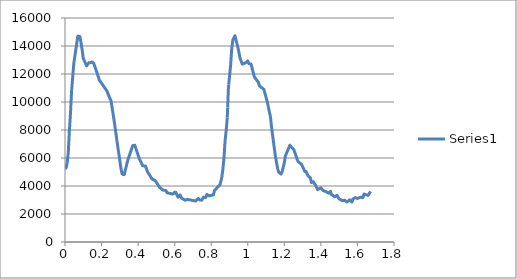
| Category | Series 0 |
|---|---|
| 0.0 | 5230.77 |
| 0.002 | 5251.89 |
| 0.004 | 5273.01 |
| 0.006 | 5294.12 |
| 0.008 | 5420.82 |
| 0.01 | 5547.52 |
| 0.012 | 5674.21 |
| 0.014 | 5917.04 |
| 0.016 | 6159.87 |
| 0.018 | 6402.71 |
| 0.02 | 6920.06 |
| 0.022 | 7437.41 |
| 0.024 | 7954.75 |
| 0.026 | 8366.52 |
| 0.028 | 8778.29 |
| 0.03 | 9190.05 |
| 0.032 | 9717.97 |
| 0.034 | 10245.89 |
| 0.036 | 10773.8 |
| 0.038 | 11101.1 |
| 0.04 | 11428.4 |
| 0.042 | 11755.7 |
| 0.044 | 12083 |
| 0.046 | 12410.3 |
| 0.048 | 12737.6 |
| 0.05 | 12916.13 |
| 0.052 | 13094.66 |
| 0.054 | 13273.19 |
| 0.056 | 13451.72 |
| 0.058 | 13630.25 |
| 0.06 | 13808.78 |
| 0.062 | 13987.31 |
| 0.064 | 14165.84 |
| 0.066 | 14344.37 |
| 0.068 | 14522.9 |
| 0.07 | 14701.4 |
| 0.072 | 14694.62 |
| 0.074 | 14687.84 |
| 0.076 | 14681.06 |
| 0.078 | 14674.28 |
| 0.08 | 14667.5 |
| 0.082 | 14660.7 |
| 0.084 | 14503.83 |
| 0.086 | 14346.96 |
| 0.088 | 14190.09 |
| 0.09 | 14033.22 |
| 0.092 | 13876.35 |
| 0.094 | 13719.5 |
| 0.096 | 13518.87 |
| 0.098 | 13318.24 |
| 0.1 | 13117.6 |
| 0.102 | 13057.78 |
| 0.104 | 12997.96 |
| 0.106 | 12938.14 |
| 0.108 | 12878.32 |
| 0.11 | 12818.5 |
| 0.112 | 12758.68 |
| 0.114 | 12698.86 |
| 0.116 | 12639.04 |
| 0.118 | 12579.2 |
| 0.12 | 12616.15 |
| 0.122 | 12653.1 |
| 0.124 | 12690.05 |
| 0.126 | 12727 |
| 0.128 | 12763.95 |
| 0.13 | 12800.9 |
| 0.132 | 12800.9 |
| 0.134 | 12800.9 |
| 0.136 | 12800.9 |
| 0.138 | 12811.47 |
| 0.14 | 12822.04 |
| 0.142 | 12832.61 |
| 0.144 | 12843.18 |
| 0.146 | 12853.75 |
| 0.148 | 12864.3 |
| 0.15 | 12838.96 |
| 0.152 | 12813.62 |
| 0.154 | 12788.28 |
| 0.156 | 12762.94 |
| 0.158 | 12737.6 |
| 0.16 | 12660.17 |
| 0.162 | 12582.74 |
| 0.164 | 12505.31 |
| 0.166 | 12427.88 |
| 0.168 | 12350.45 |
| 0.17 | 12273.02 |
| 0.172 | 12195.59 |
| 0.174 | 12118.16 |
| 0.176 | 12040.7 |
| 0.178 | 11961.68 |
| 0.18 | 11882.66 |
| 0.182 | 11803.64 |
| 0.184 | 11724.62 |
| 0.186 | 11645.6 |
| 0.188 | 11565.6 |
| 0.19 | 11527.9 |
| 0.192 | 11490.2 |
| 0.194 | 11452.5 |
| 0.196 | 11414.8 |
| 0.198 | 11377.1 |
| 0.2 | 11339.4 |
| 0.202 | 11301.7 |
| 0.204 | 11264 |
| 0.206 | 11226.3 |
| 0.208 | 11188.6 |
| 0.21 | 11150.9 |
| 0.212 | 11113.2 |
| 0.214 | 11075.5 |
| 0.216 | 11037.8 |
| 0.218 | 11000.1 |
| 0.22 | 10962.4 |
| 0.222 | 10924.7 |
| 0.224 | 10887 |
| 0.226 | 10849.3 |
| 0.228 | 10811.6 |
| 0.23 | 10773.8 |
| 0.232 | 10705.17 |
| 0.234 | 10636.54 |
| 0.236 | 10567.91 |
| 0.238 | 10499.28 |
| 0.24 | 10430.65 |
| 0.242 | 10362 |
| 0.244 | 10304.98 |
| 0.246 | 10247.96 |
| 0.248 | 10190.94 |
| 0.25 | 10133.92 |
| 0.252 | 10076.9 |
| 0.254 | 9907.97 |
| 0.256 | 9739.04 |
| 0.258 | 9570.11 |
| 0.26 | 9401.18 |
| 0.262 | 9232.25 |
| 0.264 | 9063.32 |
| 0.266 | 8894.39 |
| 0.268 | 8725.46 |
| 0.27 | 8556.56 |
| 0.272 | 8370.03 |
| 0.274 | 8183.5 |
| 0.276 | 7996.97 |
| 0.278 | 7810.44 |
| 0.28 | 7623.91 |
| 0.282 | 7437.38 |
| 0.284 | 7250.85 |
| 0.286 | 7064.32 |
| 0.288 | 6877.83 |
| 0.29 | 6698.34 |
| 0.292 | 6518.85 |
| 0.294 | 6339.36 |
| 0.296 | 6159.87 |
| 0.298 | 5980.38 |
| 0.3 | 5800.89 |
| 0.302 | 5621.4 |
| 0.304 | 5441.91 |
| 0.306 | 5262.44 |
| 0.308 | 5135.74 |
| 0.31 | 5009.04 |
| 0.312 | 4882.35 |
| 0.314 | 4861.23 |
| 0.316 | 4840.11 |
| 0.318 | 4819 |
| 0.32 | 4819 |
| 0.322 | 4819 |
| 0.324 | 4819 |
| 0.326 | 4924.58 |
| 0.328 | 5030.16 |
| 0.33 | 5135.74 |
| 0.332 | 5241.32 |
| 0.334 | 5346.9 |
| 0.336 | 5452.48 |
| 0.338 | 5558.06 |
| 0.34 | 5663.64 |
| 0.342 | 5769.23 |
| 0.344 | 5848.42 |
| 0.346 | 5927.61 |
| 0.348 | 6006.8 |
| 0.35 | 6085.99 |
| 0.352 | 6165.18 |
| 0.354 | 6244.37 |
| 0.356 | 6323.56 |
| 0.358 | 6402.75 |
| 0.36 | 6481.94 |
| 0.362 | 6561.13 |
| 0.364 | 6640.32 |
| 0.366 | 6719.51 |
| 0.368 | 6798.7 |
| 0.37 | 6877.83 |
| 0.372 | 6884.16 |
| 0.374 | 6890.49 |
| 0.376 | 6896.82 |
| 0.378 | 6903.15 |
| 0.38 | 6909.48 |
| 0.382 | 6909.5 |
| 0.384 | 6830.31 |
| 0.386 | 6751.12 |
| 0.388 | 6671.93 |
| 0.39 | 6592.74 |
| 0.392 | 6513.55 |
| 0.394 | 6434.36 |
| 0.396 | 6355.17 |
| 0.398 | 6275.98 |
| 0.4 | 6196.79 |
| 0.402 | 6117.6 |
| 0.404 | 6038.41 |
| 0.406 | 5959.28 |
| 0.408 | 5906.49 |
| 0.41 | 5853.7 |
| 0.412 | 5800.91 |
| 0.414 | 5748.12 |
| 0.416 | 5695.33 |
| 0.418 | 5642.53 |
| 0.42 | 5579.18 |
| 0.422 | 5515.83 |
| 0.424 | 5452.49 |
| 0.426 | 5448.53 |
| 0.428 | 5444.57 |
| 0.43 | 5440.61 |
| 0.432 | 5436.65 |
| 0.434 | 5432.69 |
| 0.436 | 5428.73 |
| 0.438 | 5424.77 |
| 0.44 | 5420.81 |
| 0.442 | 5352.18 |
| 0.444 | 5283.55 |
| 0.446 | 5214.92 |
| 0.448 | 5146.29 |
| 0.45 | 5077.66 |
| 0.452 | 5009.05 |
| 0.454 | 4966.82 |
| 0.456 | 4924.59 |
| 0.458 | 4882.36 |
| 0.46 | 4840.13 |
| 0.462 | 4797.9 |
| 0.464 | 4755.67 |
| 0.466 | 4713.44 |
| 0.468 | 4671.21 |
| 0.47 | 4628.98 |
| 0.472 | 4586.75 |
| 0.474 | 4544.52 |
| 0.476 | 4502.26 |
| 0.478 | 4488.18 |
| 0.48 | 4474.1 |
| 0.482 | 4460.02 |
| 0.484 | 4445.94 |
| 0.486 | 4431.86 |
| 0.488 | 4417.78 |
| 0.49 | 4403.7 |
| 0.492 | 4389.62 |
| 0.494 | 4375.57 |
| 0.496 | 4335.98 |
| 0.498 | 4296.39 |
| 0.5 | 4256.8 |
| 0.502 | 4217.21 |
| 0.504 | 4177.62 |
| 0.506 | 4138.03 |
| 0.508 | 4098.44 |
| 0.51 | 4058.85 |
| 0.512 | 4019.26 |
| 0.514 | 3979.67 |
| 0.516 | 3940.08 |
| 0.518 | 3900.45 |
| 0.52 | 3879.33 |
| 0.522 | 3858.21 |
| 0.524 | 3837.09 |
| 0.526 | 3815.97 |
| 0.528 | 3794.85 |
| 0.53 | 3773.73 |
| 0.532 | 3752.61 |
| 0.534 | 3731.49 |
| 0.536 | 3710.41 |
| 0.538 | 3706.45 |
| 0.54 | 3702.49 |
| 0.542 | 3698.53 |
| 0.544 | 3694.57 |
| 0.546 | 3690.61 |
| 0.548 | 3686.65 |
| 0.55 | 3682.69 |
| 0.552 | 3678.73 |
| 0.554 | 3625.94 |
| 0.556 | 3573.15 |
| 0.558 | 3520.36 |
| 0.56 | 3514.03 |
| 0.562 | 3507.7 |
| 0.564 | 3501.37 |
| 0.566 | 3495.04 |
| 0.568 | 3488.71 |
| 0.57 | 3482.38 |
| 0.572 | 3476.05 |
| 0.574 | 3469.72 |
| 0.576 | 3463.39 |
| 0.578 | 3457.06 |
| 0.58 | 3450.73 |
| 0.582 | 3444.4 |
| 0.584 | 3438.07 |
| 0.586 | 3431.74 |
| 0.588 | 3425.34 |
| 0.59 | 3435.9 |
| 0.592 | 3446.46 |
| 0.594 | 3457.01 |
| 0.596 | 3488.69 |
| 0.598 | 3520.37 |
| 0.6 | 3552.04 |
| 0.602 | 3552.04 |
| 0.604 | 3552.04 |
| 0.606 | 3552.04 |
| 0.608 | 3493.97 |
| 0.61 | 3435.9 |
| 0.612 | 3377.83 |
| 0.614 | 3319.76 |
| 0.616 | 3261.69 |
| 0.618 | 3203.62 |
| 0.62 | 3230.02 |
| 0.622 | 3256.42 |
| 0.624 | 3282.82 |
| 0.626 | 3309.22 |
| 0.628 | 3335.62 |
| 0.63 | 3361.99 |
| 0.632 | 3288.08 |
| 0.634 | 3214.17 |
| 0.636 | 3140.27 |
| 0.638 | 3125.87 |
| 0.64 | 3111.47 |
| 0.642 | 3097.07 |
| 0.644 | 3082.67 |
| 0.646 | 3068.27 |
| 0.648 | 3053.87 |
| 0.65 | 3039.47 |
| 0.652 | 3025.07 |
| 0.654 | 3010.67 |
| 0.656 | 2996.27 |
| 0.658 | 2981.9 |
| 0.66 | 2992.46 |
| 0.662 | 3003.02 |
| 0.664 | 3013.58 |
| 0.666 | 3024.14 |
| 0.668 | 3034.7 |
| 0.67 | 3045.25 |
| 0.672 | 3039.97 |
| 0.674 | 3034.69 |
| 0.676 | 3029.41 |
| 0.678 | 3024.13 |
| 0.68 | 3018.85 |
| 0.682 | 3013.57 |
| 0.684 | 3008.29 |
| 0.686 | 3003.01 |
| 0.688 | 2997.73 |
| 0.69 | 2992.45 |
| 0.692 | 2987.17 |
| 0.694 | 2981.89 |
| 0.696 | 2976.61 |
| 0.698 | 2971.33 |
| 0.7 | 2966.05 |
| 0.702 | 2960.77 |
| 0.704 | 2955.49 |
| 0.706 | 2950.23 |
| 0.708 | 2944.95 |
| 0.71 | 2939.67 |
| 0.712 | 2934.39 |
| 0.714 | 2929.11 |
| 0.716 | 2923.83 |
| 0.718 | 2981.9 |
| 0.72 | 3003.02 |
| 0.722 | 3024.14 |
| 0.724 | 3045.26 |
| 0.726 | 3066.38 |
| 0.728 | 3087.5 |
| 0.73 | 3108.6 |
| 0.732 | 3076.92 |
| 0.734 | 3045.24 |
| 0.736 | 3013.57 |
| 0.738 | 3008.29 |
| 0.74 | 3003.01 |
| 0.742 | 2997.73 |
| 0.744 | 2992.45 |
| 0.746 | 2987.17 |
| 0.748 | 2981.89 |
| 0.75 | 3026.04 |
| 0.752 | 3070.19 |
| 0.754 | 3114.34 |
| 0.756 | 3158.49 |
| 0.758 | 3202.62 |
| 0.76 | 3197.51 |
| 0.762 | 3192.4 |
| 0.764 | 3187.29 |
| 0.766 | 3182.18 |
| 0.768 | 3177.07 |
| 0.77 | 3171.95 |
| 0.772 | 3245.86 |
| 0.774 | 3319.77 |
| 0.776 | 3393.67 |
| 0.778 | 3377.83 |
| 0.78 | 3361.99 |
| 0.782 | 3346.15 |
| 0.784 | 3330.31 |
| 0.786 | 3314.47 |
| 0.788 | 3298.64 |
| 0.79 | 3303.92 |
| 0.792 | 3309.2 |
| 0.794 | 3314.48 |
| 0.796 | 3319.76 |
| 0.798 | 3325.04 |
| 0.8 | 3330.32 |
| 0.802 | 3335.6 |
| 0.804 | 3340.88 |
| 0.806 | 3346.16 |
| 0.808 | 3351.44 |
| 0.81 | 3356.72 |
| 0.812 | 3361.99 |
| 0.814 | 3467.57 |
| 0.816 | 3573.15 |
| 0.818 | 3678.73 |
| 0.82 | 3706.18 |
| 0.822 | 3733.63 |
| 0.824 | 3761.08 |
| 0.826 | 3788.53 |
| 0.828 | 3815.98 |
| 0.83 | 3843.43 |
| 0.832 | 3870.88 |
| 0.834 | 3898.33 |
| 0.836 | 3925.78 |
| 0.838 | 3953.23 |
| 0.84 | 3980.68 |
| 0.842 | 4008.13 |
| 0.844 | 4035.58 |
| 0.846 | 4063.03 |
| 0.848 | 4090.5 |
| 0.85 | 4198.19 |
| 0.852 | 4305.88 |
| 0.854 | 4413.57 |
| 0.856 | 4521.26 |
| 0.858 | 4628.96 |
| 0.86 | 4829.56 |
| 0.862 | 5030.16 |
| 0.864 | 5230.77 |
| 0.866 | 5505.28 |
| 0.868 | 5779.79 |
| 0.87 | 6054.3 |
| 0.872 | 6455.51 |
| 0.874 | 6856.72 |
| 0.876 | 7257.92 |
| 0.878 | 7500.76 |
| 0.88 | 7743.6 |
| 0.882 | 7986.43 |
| 0.884 | 8292.61 |
| 0.886 | 8598.79 |
| 0.888 | 8904.98 |
| 0.89 | 9601.82 |
| 0.892 | 10298.66 |
| 0.894 | 10995.5 |
| 0.896 | 11264.73 |
| 0.898 | 11533.96 |
| 0.9 | 11803.19 |
| 0.902 | 12072.42 |
| 0.904 | 12341.65 |
| 0.906 | 12610.9 |
| 0.908 | 13001.53 |
| 0.91 | 13392.16 |
| 0.912 | 13782.8 |
| 0.914 | 13993.97 |
| 0.916 | 14205.14 |
| 0.918 | 14416.3 |
| 0.92 | 14469.08 |
| 0.922 | 14521.86 |
| 0.924 | 14574.64 |
| 0.926 | 14627.42 |
| 0.928 | 14680.2 |
| 0.93 | 14733 |
| 0.932 | 14627.42 |
| 0.934 | 14521.84 |
| 0.936 | 14416.26 |
| 0.938 | 14310.68 |
| 0.94 | 14205.1 |
| 0.942 | 14099.52 |
| 0.944 | 13993.94 |
| 0.946 | 13888.36 |
| 0.948 | 13782.8 |
| 0.95 | 13649.76 |
| 0.952 | 13516.72 |
| 0.954 | 13383.68 |
| 0.956 | 13250.64 |
| 0.958 | 13117.6 |
| 0.96 | 13048.98 |
| 0.962 | 12980.36 |
| 0.964 | 12911.74 |
| 0.966 | 12843.12 |
| 0.968 | 12774.5 |
| 0.97 | 12705.9 |
| 0.972 | 12716.46 |
| 0.974 | 12727.02 |
| 0.976 | 12737.58 |
| 0.978 | 12748.14 |
| 0.98 | 12758.7 |
| 0.982 | 12769.26 |
| 0.984 | 12779.82 |
| 0.986 | 12790.38 |
| 0.988 | 12800.9 |
| 0.99 | 12822.02 |
| 0.992 | 12843.14 |
| 0.994 | 12864.26 |
| 0.996 | 12885.38 |
| 0.998 | 12906.5 |
| 1.0 | 12927.6 |
| 1.002 | 12864.27 |
| 1.004 | 12800.94 |
| 1.006 | 12737.6 |
| 1.008 | 12732.32 |
| 1.01 | 12727.04 |
| 1.012 | 12721.76 |
| 1.014 | 12716.48 |
| 1.016 | 12711.2 |
| 1.018 | 12705.9 |
| 1.02 | 12603.83 |
| 1.022 | 12501.76 |
| 1.024 | 12399.69 |
| 1.026 | 12297.62 |
| 1.028 | 12195.55 |
| 1.03 | 12093.48 |
| 1.032 | 11991.41 |
| 1.034 | 11889.34 |
| 1.036 | 11787.3 |
| 1.038 | 11752.75 |
| 1.04 | 11718.2 |
| 1.042 | 11683.65 |
| 1.044 | 11649.1 |
| 1.046 | 11614.55 |
| 1.048 | 11580 |
| 1.05 | 11545.45 |
| 1.052 | 11510.9 |
| 1.054 | 11476.35 |
| 1.056 | 11441.8 |
| 1.058 | 11407.2 |
| 1.06 | 11322.73 |
| 1.062 | 11238.26 |
| 1.064 | 11153.8 |
| 1.066 | 11132.69 |
| 1.068 | 11111.58 |
| 1.07 | 11090.47 |
| 1.072 | 11069.36 |
| 1.074 | 11048.25 |
| 1.076 | 11027.14 |
| 1.078 | 11006.03 |
| 1.08 | 10984.92 |
| 1.082 | 10963.81 |
| 1.084 | 10942.7 |
| 1.086 | 10921.59 |
| 1.088 | 10900.5 |
| 1.09 | 10805.47 |
| 1.092 | 10710.44 |
| 1.094 | 10615.41 |
| 1.096 | 10520.38 |
| 1.098 | 10425.35 |
| 1.1 | 10330.32 |
| 1.102 | 10235.29 |
| 1.104 | 10140.26 |
| 1.106 | 10045.2 |
| 1.108 | 9922.03 |
| 1.11 | 9798.86 |
| 1.112 | 9675.69 |
| 1.114 | 9552.52 |
| 1.116 | 9429.35 |
| 1.118 | 9306.18 |
| 1.12 | 9183.01 |
| 1.122 | 9059.84 |
| 1.124 | 8936.65 |
| 1.126 | 8693.81 |
| 1.128 | 8450.97 |
| 1.13 | 8208.14 |
| 1.132 | 8007.54 |
| 1.134 | 7806.94 |
| 1.136 | 7606.34 |
| 1.138 | 7405.74 |
| 1.14 | 7205.14 |
| 1.142 | 7004.52 |
| 1.144 | 6814.48 |
| 1.146 | 6624.44 |
| 1.148 | 6434.4 |
| 1.15 | 6244.36 |
| 1.152 | 6054.3 |
| 1.154 | 5911.77 |
| 1.156 | 5769.24 |
| 1.158 | 5626.71 |
| 1.16 | 5484.18 |
| 1.162 | 5341.65 |
| 1.164 | 5199.1 |
| 1.166 | 5125.19 |
| 1.168 | 5051.28 |
| 1.17 | 4977.38 |
| 1.172 | 4956.26 |
| 1.174 | 4935.14 |
| 1.176 | 4914.02 |
| 1.178 | 4892.9 |
| 1.18 | 4871.78 |
| 1.182 | 4850.68 |
| 1.184 | 4903.47 |
| 1.186 | 4956.26 |
| 1.188 | 5009.05 |
| 1.19 | 5119.91 |
| 1.192 | 5230.77 |
| 1.194 | 5341.63 |
| 1.196 | 5452.49 |
| 1.198 | 5563.35 |
| 1.2 | 5674.21 |
| 1.202 | 5832.58 |
| 1.204 | 5990.95 |
| 1.206 | 6149.32 |
| 1.208 | 6212.67 |
| 1.21 | 6276.02 |
| 1.212 | 6339.37 |
| 1.214 | 6402.72 |
| 1.216 | 6466.07 |
| 1.218 | 6529.42 |
| 1.22 | 6592.77 |
| 1.222 | 6656.12 |
| 1.224 | 6719.47 |
| 1.226 | 6782.82 |
| 1.228 | 6846.17 |
| 1.23 | 6909.5 |
| 1.232 | 6880.71 |
| 1.234 | 6851.92 |
| 1.236 | 6823.13 |
| 1.238 | 6794.34 |
| 1.24 | 6765.55 |
| 1.242 | 6736.76 |
| 1.244 | 6707.97 |
| 1.246 | 6679.18 |
| 1.248 | 6650.39 |
| 1.25 | 6621.6 |
| 1.252 | 6592.76 |
| 1.254 | 6518.85 |
| 1.256 | 6444.94 |
| 1.258 | 6371.03 |
| 1.26 | 6297.12 |
| 1.262 | 6223.21 |
| 1.264 | 6149.32 |
| 1.266 | 6064.86 |
| 1.268 | 5980.4 |
| 1.27 | 5895.93 |
| 1.272 | 5843.14 |
| 1.274 | 5790.35 |
| 1.276 | 5737.56 |
| 1.278 | 5716.44 |
| 1.28 | 5695.32 |
| 1.282 | 5674.2 |
| 1.284 | 5653.08 |
| 1.286 | 5631.96 |
| 1.288 | 5610.84 |
| 1.29 | 5589.72 |
| 1.292 | 5568.6 |
| 1.294 | 5547.51 |
| 1.296 | 5491.2 |
| 1.298 | 5434.89 |
| 1.3 | 5378.58 |
| 1.302 | 5322.27 |
| 1.304 | 5265.96 |
| 1.306 | 5209.65 |
| 1.308 | 5153.34 |
| 1.31 | 5097.03 |
| 1.312 | 5040.72 |
| 1.314 | 5040.72 |
| 1.316 | 5040.72 |
| 1.318 | 5040.72 |
| 1.32 | 4987.93 |
| 1.322 | 4935.14 |
| 1.324 | 4882.35 |
| 1.326 | 4829.56 |
| 1.328 | 4776.77 |
| 1.33 | 4723.98 |
| 1.332 | 4702.86 |
| 1.334 | 4681.74 |
| 1.336 | 4660.62 |
| 1.338 | 4639.5 |
| 1.34 | 4618.38 |
| 1.342 | 4597.29 |
| 1.344 | 4481.15 |
| 1.346 | 4365.01 |
| 1.348 | 4248.87 |
| 1.35 | 4261.54 |
| 1.352 | 4274.21 |
| 1.354 | 4286.88 |
| 1.356 | 4299.55 |
| 1.358 | 4312.22 |
| 1.36 | 4275.27 |
| 1.362 | 4238.32 |
| 1.364 | 4193.98 |
| 1.366 | 4149.64 |
| 1.368 | 4105.3 |
| 1.37 | 4090.5 |
| 1.372 | 4032.43 |
| 1.374 | 3974.36 |
| 1.376 | 3916.29 |
| 1.378 | 3858.22 |
| 1.38 | 3800.15 |
| 1.382 | 3742.08 |
| 1.384 | 3756.16 |
| 1.386 | 3770.24 |
| 1.388 | 3784.32 |
| 1.39 | 3798.4 |
| 1.392 | 3812.48 |
| 1.394 | 3826.56 |
| 1.396 | 3840.64 |
| 1.398 | 3854.72 |
| 1.4 | 3868.78 |
| 1.402 | 3837.1 |
| 1.404 | 3805.42 |
| 1.406 | 3773.74 |
| 1.408 | 3742.06 |
| 1.41 | 3710.38 |
| 1.412 | 3678.73 |
| 1.414 | 3668.17 |
| 1.416 | 3657.61 |
| 1.418 | 3647.05 |
| 1.42 | 3636.49 |
| 1.422 | 3625.93 |
| 1.424 | 3615.37 |
| 1.426 | 3604.81 |
| 1.428 | 3594.25 |
| 1.43 | 3583.71 |
| 1.432 | 3567.87 |
| 1.434 | 3552.03 |
| 1.436 | 3536.19 |
| 1.438 | 3520.35 |
| 1.44 | 3504.51 |
| 1.442 | 3488.69 |
| 1.444 | 3514.03 |
| 1.446 | 3539.37 |
| 1.448 | 3564.71 |
| 1.45 | 3590.05 |
| 1.452 | 3615.38 |
| 1.454 | 3541.48 |
| 1.456 | 3467.58 |
| 1.458 | 3393.67 |
| 1.46 | 3376.07 |
| 1.462 | 3358.47 |
| 1.464 | 3340.87 |
| 1.466 | 3323.27 |
| 1.468 | 3305.67 |
| 1.47 | 3288.07 |
| 1.472 | 3270.47 |
| 1.474 | 3252.87 |
| 1.476 | 3235.29 |
| 1.478 | 3251.13 |
| 1.48 | 3266.97 |
| 1.482 | 3282.81 |
| 1.484 | 3298.65 |
| 1.486 | 3314.49 |
| 1.488 | 3330.32 |
| 1.49 | 3288.09 |
| 1.492 | 3245.86 |
| 1.494 | 3203.63 |
| 1.496 | 3161.4 |
| 1.498 | 3119.17 |
| 1.5 | 3076.92 |
| 1.502 | 3062.84 |
| 1.504 | 3048.76 |
| 1.506 | 3034.68 |
| 1.508 | 3020.6 |
| 1.51 | 3006.52 |
| 1.512 | 2992.44 |
| 1.514 | 2978.36 |
| 1.516 | 2964.28 |
| 1.518 | 2950.23 |
| 1.52 | 2955.51 |
| 1.522 | 2960.79 |
| 1.524 | 2966.07 |
| 1.526 | 2971.35 |
| 1.528 | 2976.63 |
| 1.53 | 2981.9 |
| 1.532 | 2960.78 |
| 1.534 | 2939.66 |
| 1.536 | 2918.54 |
| 1.538 | 2897.42 |
| 1.54 | 2876.3 |
| 1.542 | 2855.2 |
| 1.544 | 2875 |
| 1.546 | 2894.8 |
| 1.548 | 2914.6 |
| 1.55 | 2934.4 |
| 1.552 | 2954.2 |
| 1.554 | 2974 |
| 1.556 | 2993.8 |
| 1.558 | 3013.57 |
| 1.56 | 2987.17 |
| 1.562 | 2960.77 |
| 1.564 | 2934.37 |
| 1.566 | 2907.97 |
| 1.568 | 2881.57 |
| 1.57 | 2855.2 |
| 1.572 | 2929.11 |
| 1.574 | 3003.02 |
| 1.576 | 3076.92 |
| 1.578 | 3092.76 |
| 1.58 | 3108.6 |
| 1.582 | 3124.44 |
| 1.584 | 3140.28 |
| 1.586 | 3156.12 |
| 1.588 | 3171.95 |
| 1.59 | 3161.39 |
| 1.592 | 3150.83 |
| 1.594 | 3140.27 |
| 1.596 | 3129.71 |
| 1.598 | 3119.15 |
| 1.6 | 3108.6 |
| 1.602 | 3119.16 |
| 1.604 | 3129.72 |
| 1.606 | 3140.28 |
| 1.608 | 3150.84 |
| 1.61 | 3161.4 |
| 1.612 | 3171.96 |
| 1.614 | 3182.52 |
| 1.616 | 3193.08 |
| 1.618 | 3203.62 |
| 1.62 | 3198.34 |
| 1.622 | 3193.06 |
| 1.624 | 3187.78 |
| 1.626 | 3182.5 |
| 1.628 | 3177.22 |
| 1.63 | 3171.95 |
| 1.632 | 3256.41 |
| 1.634 | 3340.87 |
| 1.636 | 3425.34 |
| 1.638 | 3416.7 |
| 1.64 | 3408.06 |
| 1.642 | 3399.42 |
| 1.644 | 3390.78 |
| 1.646 | 3382.14 |
| 1.648 | 3373.5 |
| 1.65 | 3364.86 |
| 1.652 | 3356.22 |
| 1.654 | 3347.58 |
| 1.656 | 3338.94 |
| 1.658 | 3330.32 |
| 1.66 | 3371.04 |
| 1.662 | 3411.76 |
| 1.664 | 3452.48 |
| 1.666 | 3493.2 |
| 1.668 | 3533.92 |
| 1.67 | 3574.64 |
| 1.672 | 3615.38 |